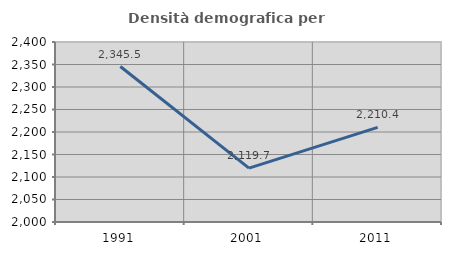
| Category | Densità demografica |
|---|---|
| 1991.0 | 2345.466 |
| 2001.0 | 2119.726 |
| 2011.0 | 2210.383 |